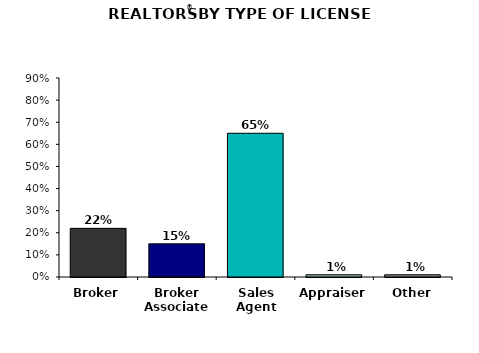
| Category | Series 0 |
|---|---|
| Broker | 22 |
| Broker Associate | 15 |
| Sales Agent | 65 |
| Appraiser | 1 |
| Other | 1 |